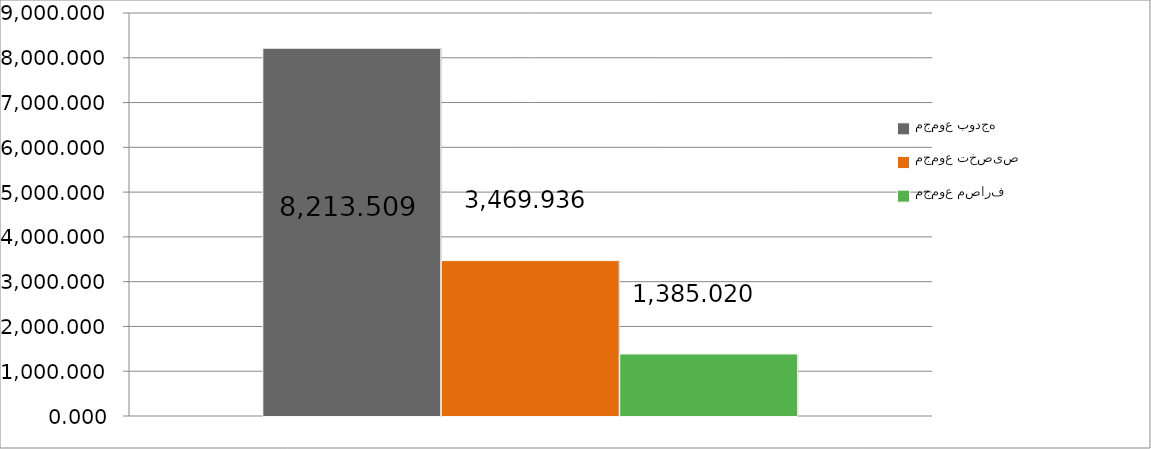
| Category | مجموع بودجه  | مجموع تخصیص | مجموع مصارف |
|---|---|---|---|
| 0 | 8213.509 | 3469.936 | 1385.02 |